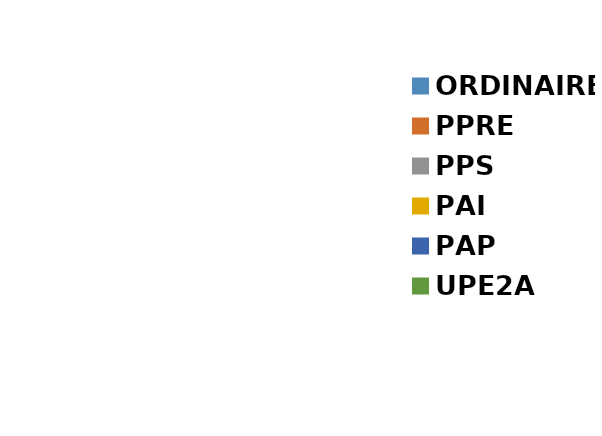
| Category | Series 0 |
|---|---|
| ORDINAIRE | 0 |
| PPRE | 0 |
| PPS | 0 |
| PAI | 0 |
| PAP | 0 |
| UPE2A | 0 |